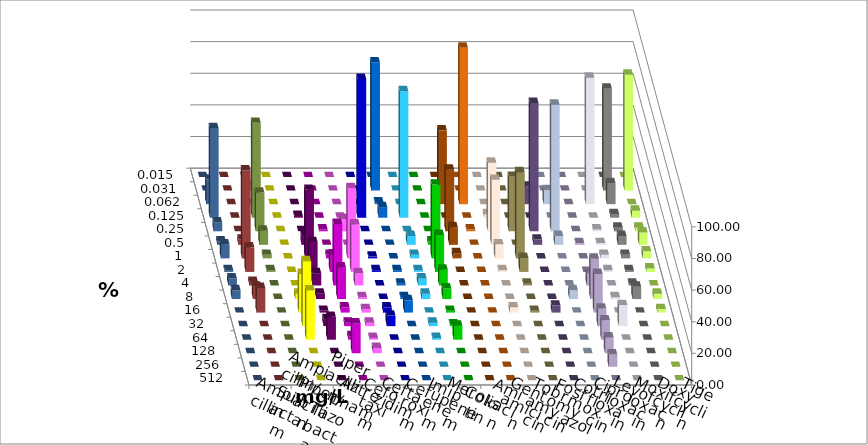
| Category | Ampicillin | Ampicillin/ Sulbactam | Piperacillin | Piperacillin/ Tazobactam | Aztreonam | Cefotaxim | Ceftazidim | Cefuroxim | Imipenem | Meropenem | Colistin | Amikacin | Gentamicin | Tobramycin | Fosfomycin | Cotrimoxazol | Ciprofloxacin | Levofloxacin | Moxifloxacin | Doxycyclin | Tigecyclin |
|---|---|---|---|---|---|---|---|---|---|---|---|---|---|---|---|---|---|---|---|---|---|
| 0.015 | 0 | 0 | 0 | 0 | 0 | 0 | 0 | 0 | 0 | 0 | 0 | 0 | 0 | 0 | 0 | 0 | 0 | 0 | 0 | 0 | 0 |
| 0.031 | 0 | 0 | 0 | 0 | 0 | 81.111 | 0 | 0 | 0 | 0 | 0 | 0 | 0 | 0 | 0 | 0 | 64.444 | 73.333 | 0 | 0 | 3.333 |
| 0.062 | 0 | 0 | 0 | 0 | 0 | 1.111 | 0 | 0 | 46.667 | 98.889 | 0 | 0 | 11.111 | 8.889 | 0 | 80 | 13.333 | 0 | 15.556 | 0 | 0 |
| 0.125 | 0 | 1.111 | 0 | 0 | 87.778 | 6.667 | 80 | 0 | 0 | 0 | 2.222 | 0 | 0 | 0 | 0 | 0 | 2.222 | 4.444 | 56.667 | 0 | 60 |
| 0.25 | 0 | 0 | 1.111 | 7.778 | 0 | 0 | 0 | 0 | 38.889 | 1.111 | 43.333 | 34.444 | 81.111 | 80 | 0 | 1.111 | 2.222 | 2.222 | 5.556 | 0 | 24.444 |
| 0.5 | 0 | 5.556 | 0 | 0 | 0 | 0 | 5.556 | 2.222 | 11.111 | 0 | 41.111 | 0 | 3.333 | 5.556 | 1.111 | 1.111 | 5.556 | 7.778 | 2.222 | 3.333 | 8.889 |
| 1.0 | 0 | 43.333 | 2.222 | 44.444 | 1.111 | 0 | 2.222 | 46.667 | 3.333 | 0 | 8.889 | 54.444 | 0 | 0 | 0 | 2.222 | 2.222 | 4.444 | 8.889 | 55.556 | 2.222 |
| 2.0 | 0 | 18.889 | 11.111 | 30 | 1.111 | 1.111 | 1.111 | 23.333 | 0 | 0 | 1.111 | 8.889 | 0 | 0 | 0 | 1.111 | 1.111 | 2.222 | 1.111 | 15.556 | 1.111 |
| 4.0 | 0 | 7.778 | 38.889 | 7.778 | 0 | 1.111 | 4.444 | 10 | 0 | 0 | 0 | 1.111 | 0 | 0 | 7.778 | 0 | 1.111 | 0 | 4.444 | 2.222 | 0 |
| 8.0 | 3.333 | 3.333 | 20 | 1.111 | 0 | 1.111 | 3.333 | 6.667 | 0 | 0 | 0 | 0 | 0 | 5.556 | 25.556 | 1.111 | 7.778 | 3.333 | 5.556 | 7.778 | 0 |
| 16.0 | 24.444 | 1.111 | 3.333 | 2.222 | 3.333 | 7.778 | 0 | 1.111 | 0 | 0 | 3.333 | 1.111 | 4.444 | 0 | 24.444 | 0 | 0 | 2.222 | 0 | 15.556 | 0 |
| 32.0 | 41.111 | 4.444 | 2.222 | 2.222 | 6.667 | 0 | 2.222 | 1.111 | 0 | 0 | 0 | 0 | 0 | 0 | 11.111 | 13.333 | 0 | 0 | 0 | 0 | 0 |
| 64.0 | 31.111 | 14.444 | 2.222 | 1.111 | 0 | 0 | 1.111 | 8.889 | 0 | 0 | 0 | 0 | 0 | 0 | 12.222 | 0 | 0 | 0 | 0 | 0 | 0 |
| 128.0 | 0 | 0 | 18.889 | 3.333 | 0 | 0 | 0 | 0 | 0 | 0 | 0 | 0 | 0 | 0 | 10 | 0 | 0 | 0 | 0 | 0 | 0 |
| 256.0 | 0 | 0 | 0 | 0 | 0 | 0 | 0 | 0 | 0 | 0 | 0 | 0 | 0 | 0 | 7.778 | 0 | 0 | 0 | 0 | 0 | 0 |
| 512.0 | 0 | 0 | 0 | 0 | 0 | 0 | 0 | 0 | 0 | 0 | 0 | 0 | 0 | 0 | 0 | 0 | 0 | 0 | 0 | 0 | 0 |